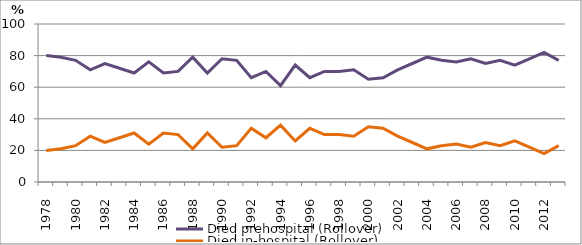
| Category | Died prehospital (Rollover) | Died in-hospital (Rollover) |
|---|---|---|
| 1978.0 | 80 | 20 |
| 1979.0 | 79 | 21 |
| 1980.0 | 77 | 23 |
| 1981.0 | 71 | 29 |
| 1982.0 | 75 | 25 |
| 1983.0 | 72 | 28 |
| 1984.0 | 69 | 31 |
| 1985.0 | 76 | 24 |
| 1986.0 | 69 | 31 |
| 1987.0 | 70 | 30 |
| 1988.0 | 79 | 21 |
| 1989.0 | 69 | 31 |
| 1990.0 | 78 | 22 |
| 1991.0 | 77 | 23 |
| 1992.0 | 66 | 34 |
| 1993.0 | 70 | 28 |
| 1994.0 | 61 | 36 |
| 1995.0 | 74 | 26 |
| 1996.0 | 66 | 34 |
| 1997.0 | 70 | 30 |
| 1998.0 | 70 | 30 |
| 1999.0 | 71 | 29 |
| 2000.0 | 65 | 35 |
| 2001.0 | 66 | 34 |
| 2002.0 | 71 | 29 |
| 2003.0 | 75 | 25 |
| 2004.0 | 79 | 21 |
| 2005.0 | 77 | 23 |
| 2006.0 | 76 | 24 |
| 2007.0 | 78 | 22 |
| 2008.0 | 75 | 25 |
| 2009.0 | 77 | 23 |
| 2010.0 | 74 | 26 |
| 2011.0 | 78 | 22 |
| 2012.0 | 82 | 18 |
| 2013.0 | 77 | 23 |